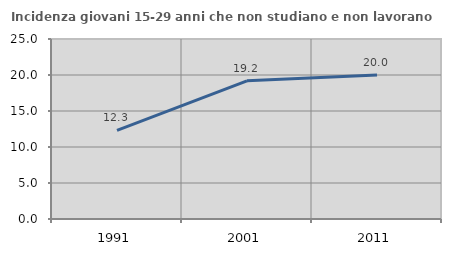
| Category | Incidenza giovani 15-29 anni che non studiano e non lavorano  |
|---|---|
| 1991.0 | 12.314 |
| 2001.0 | 19.196 |
| 2011.0 | 20 |